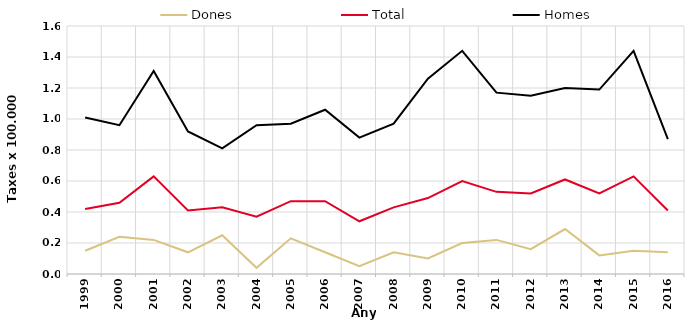
| Category | Dones | Total | Homes |
|---|---|---|---|
| 1999.0 | 0.15 | 0.42 | 1.01 |
| 2000.0 | 0.24 | 0.46 | 0.96 |
| 2001.0 | 0.22 | 0.63 | 1.31 |
| 2002.0 | 0.14 | 0.41 | 0.92 |
| 2003.0 | 0.25 | 0.43 | 0.81 |
| 2004.0 | 0.04 | 0.37 | 0.96 |
| 2005.0 | 0.23 | 0.47 | 0.97 |
| 2006.0 | 0.14 | 0.47 | 1.06 |
| 2007.0 | 0.05 | 0.34 | 0.88 |
| 2008.0 | 0.14 | 0.43 | 0.97 |
| 2009.0 | 0.1 | 0.49 | 1.26 |
| 2010.0 | 0.2 | 0.6 | 1.44 |
| 2011.0 | 0.22 | 0.53 | 1.17 |
| 2012.0 | 0.16 | 0.52 | 1.15 |
| 2013.0 | 0.29 | 0.61 | 1.2 |
| 2014.0 | 0.12 | 0.52 | 1.19 |
| 2015.0 | 0.15 | 0.63 | 1.44 |
| 2016.0 | 0.14 | 0.41 | 0.87 |